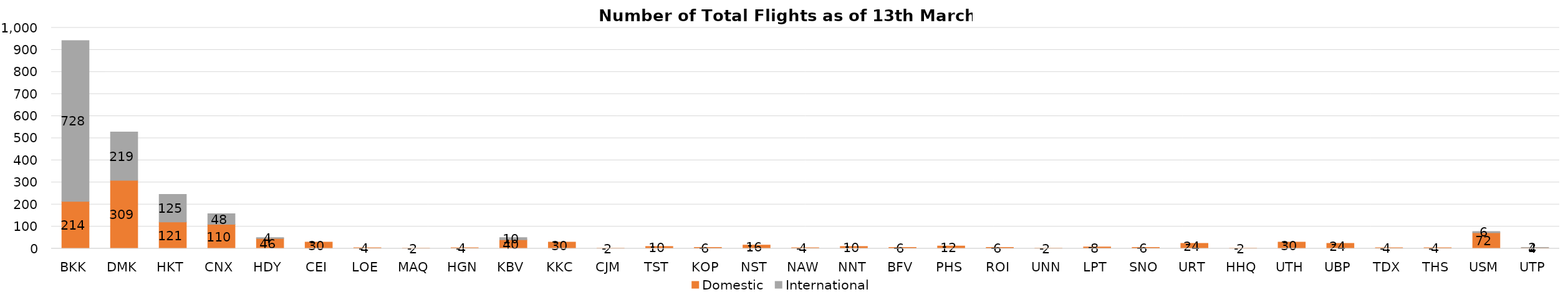
| Category | Domestic | International |
|---|---|---|
| BKK | 214 | 728 |
| DMK | 309 | 219 |
| HKT | 121 | 125 |
| CNX | 110 | 48 |
| HDY | 46 | 4 |
| CEI | 30 | 0 |
| LOE | 4 | 0 |
| MAQ | 2 | 0 |
| HGN | 4 | 0 |
| KBV | 40 | 10 |
| KKC | 30 | 0 |
| CJM | 2 | 0 |
| TST | 10 | 0 |
| KOP | 6 | 0 |
| NST | 16 | 0 |
| NAW | 4 | 0 |
| NNT | 10 | 0 |
| BFV | 6 | 0 |
| PHS | 12 | 0 |
| ROI | 6 | 0 |
| UNN | 2 | 0 |
| LPT | 8 | 0 |
| SNO | 6 | 0 |
| URT | 24 | 0 |
| HHQ | 2 | 0 |
| UTH | 30 | 0 |
| UBP | 24 | 0 |
| TDX | 4 | 0 |
| THS | 4 | 0 |
| USM | 72 | 6 |
| UTP | 4 | 2 |